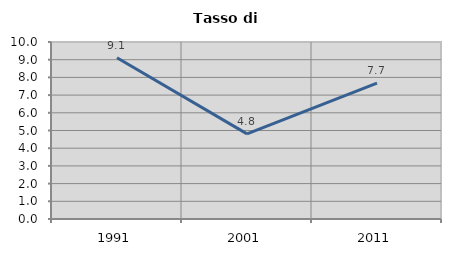
| Category | Tasso di disoccupazione   |
|---|---|
| 1991.0 | 9.109 |
| 2001.0 | 4.808 |
| 2011.0 | 7.679 |